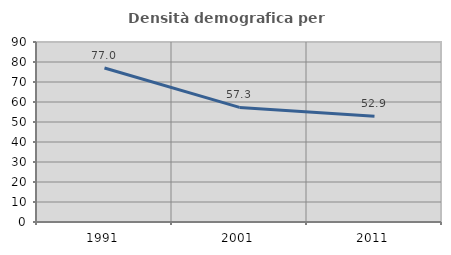
| Category | Densità demografica |
|---|---|
| 1991.0 | 77.028 |
| 2001.0 | 57.309 |
| 2011.0 | 52.92 |